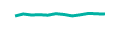
| Category | Series 1 |
|---|---|
| 0 | 1.1 |
| 1 | 1.3 |
| 2 | 1.2 |
| 3 | 1.23 |
| 4 | 1.18 |
| 5 | 1.33 |
| 6 | 1.25 |
| 7 | 1.11 |
| 8 | 1.22 |
| 9 | 1.36 |
| 10 | 1.32 |
| 11 | 1.29 |